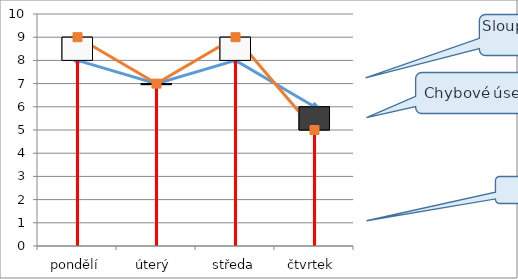
| Category | Series 0 | Series 1 |
|---|---|---|
| pondělí | 8 | 9 |
| úterý | 7 | 7 |
| středa | 8 | 9 |
| čtvrtek | 6 | 5 |